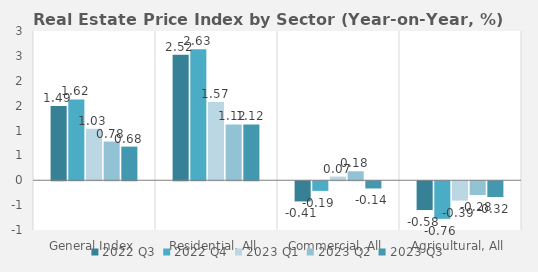
| Category | 2022 | 2023 |
|---|---|---|
| General Index | 1.625 | 0.676 |
| Residential, All | 2.634 | 1.121 |
| Commercial, All | -0.194 | -0.145 |
| Agricultural, All | -0.756 | -0.316 |